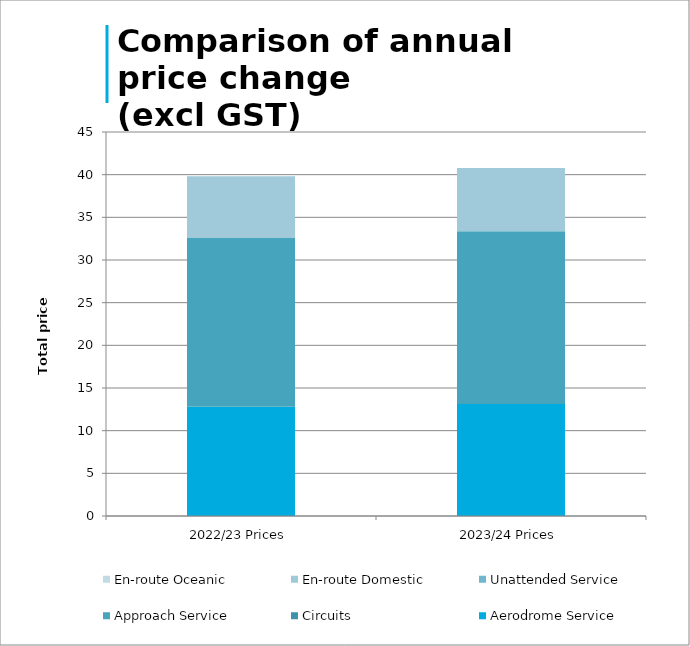
| Category | Aerodrome Service | Circuits | Approach Service | Unattended Service | En-route Domestic | En-route Oceanic |
|---|---|---|---|---|---|---|
| 2022/23 Prices | 12.81 | 0 | 19.76 | 0 | 7.25 | 0 |
| 2023/24 Prices | 13.12 | 0 | 20.24 | 0 | 7.42 | 0 |